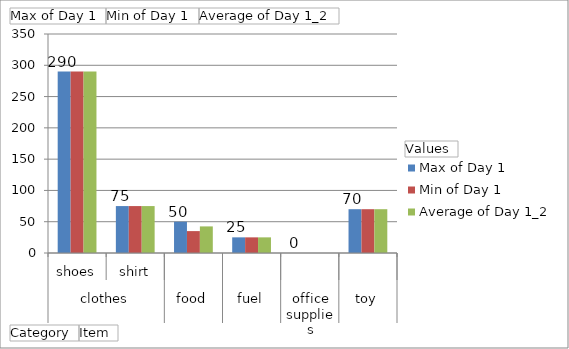
| Category | Max of Day 1 | Min of Day 1 | Average of Day 1_2 |
|---|---|---|---|
| 0 | 290 | 290 | 290 |
| 1 | 75 | 75 | 75 |
| 2 | 50 | 35 | 42.5 |
| 3 | 25 | 25 | 25 |
| 4 | 0 | 0 | 0 |
| 5 | 70 | 70 | 70 |